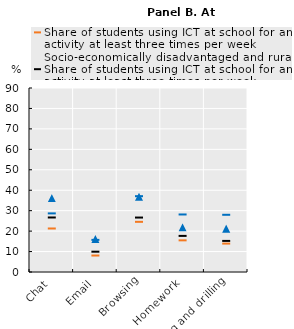
| Category | Series 0 | Series 2 | Series 1 | Series 3 |
|---|---|---|---|---|
| Chat | 21.284 | 26.666 | 28.668 | 36.141 |
| Email | 8.057 | 9.933 | 15.712 | 16.175 |
| Browsing | 24.537 | 26.631 | 37.088 | 36.787 |
| Homework | 15.483 | 17.664 | 28.138 | 21.832 |
| Practising and drilling | 13.892 | 15.208 | 27.98 | 21.188 |